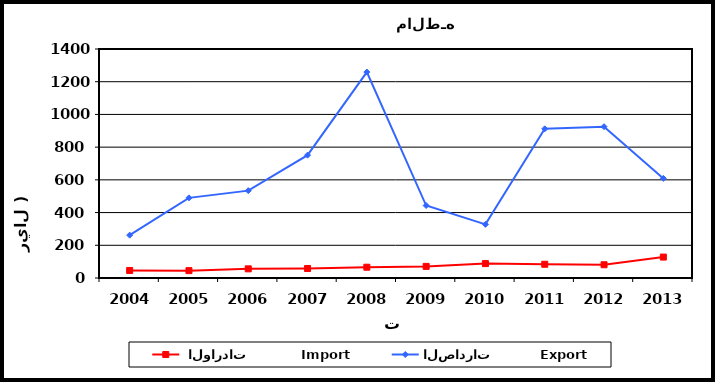
| Category |  الواردات           Import | الصادرات          Export |
|---|---|---|
| 2004.0 | 46 | 262 |
| 2005.0 | 45 | 490 |
| 2006.0 | 56 | 534 |
| 2007.0 | 58 | 751 |
| 2008.0 | 66 | 1259 |
| 2009.0 | 71 | 443 |
| 2010.0 | 88 | 328 |
| 2011.0 | 84 | 912 |
| 2012.0 | 81 | 925 |
| 2013.0 | 128 | 609 |